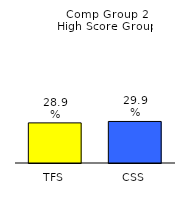
| Category | Series 0 |
|---|---|
| TFS | 0.289 |
| CSS | 0.299 |